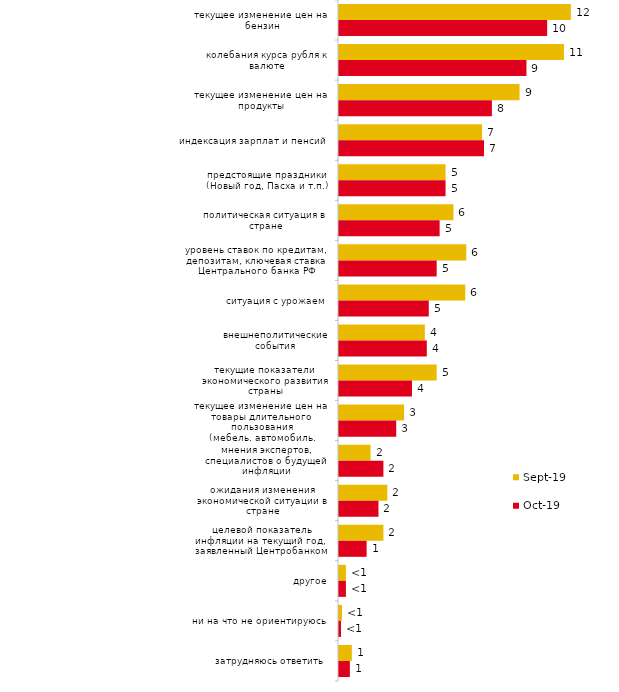
| Category | сен.19 | окт.19 |
|---|---|---|
| текущее изменение цен на бензин | 11.634 | 10.446 |
| колебания курса рубля к валюте | 11.287 | 9.406 |
| текущее изменение цен на продукты | 9.059 | 7.673 |
| индексация зарплат и пенсий | 7.178 | 7.277 |
| предстоящие праздники (Новый год, Пасха и т.п.) | 5.347 | 5.347 |
| политическая ситуация в стране | 5.743 | 5.05 |
| уровень ставок по кредитам, депозитам, ключевая ставка Центрального банка РФ | 6.386 | 4.901 |
| ситуация с урожаем | 6.337 | 4.505 |
| внешнеполитические события | 4.307 | 4.406 |
| текущие показатели экономического развития страны | 4.901 | 3.663 |
| текущее изменение цен на товары длительного пользования (мебель, автомобиль, бытовая техника и т.п.) | 3.267 | 2.871 |
| мнения экспертов, специалистов о будущей инфляции | 1.584 | 2.228 |
| ожидания изменения экономической ситуации в стране | 2.426 | 1.98 |
| целевой показатель инфляции на текущий год, заявленный Центробанком | 2.228 | 1.386 |
| другое | 0.347 | 0.347 |
| ни на что не ориентируюсь | 0.149 | 0.099 |
| затрудняюсь ответить | 0.644 | 0.545 |